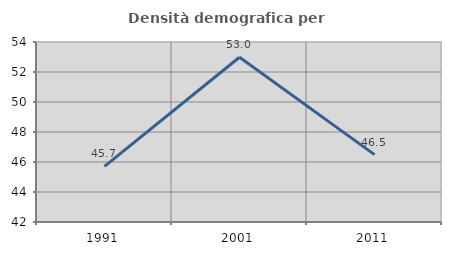
| Category | Densità demografica |
|---|---|
| 1991.0 | 45.713 |
| 2001.0 | 52.986 |
| 2011.0 | 46.492 |